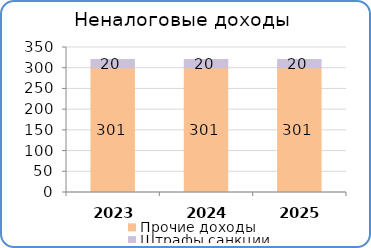
| Category | Прочие доходы | Штрафы,санкции |
|---|---|---|
| 2023 | 301000 | 20000 |
| 2024 | 301000 | 20000 |
| 2025 | 301100 | 20000 |